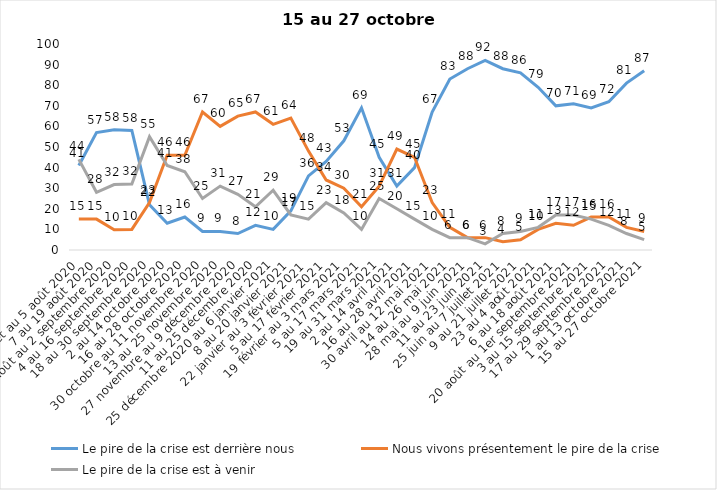
| Category | Le pire de la crise est derrière nous | Nous vivons présentement le pire de la crise | Le pire de la crise est à venir |
|---|---|---|---|
| 24 juillet au 5 août 2020 | 41 | 15 | 44 |
| 7 au 19 août 2020 | 57 | 15 | 28 |
| 21 août au 2 septembre 2020 | 58.39 | 9.84 | 31.77 |
| 4 au 16 septembre 2020 | 58 | 10 | 32 |
| 18 au 30 septembre 2020 | 22 | 23 | 55 |
| 2 au 14 octobre 2020 | 13 | 46 | 41 |
| 16 au 28 octobre 2020 | 16 | 46 | 38 |
| 30 octobre au 11 novembre 2020 | 9 | 67 | 25 |
| 13 au 25 novembre 2020 | 9 | 60 | 31 |
| 27 novembre au 9 décembre 2020 | 8 | 65 | 27 |
| 11 au 25 décembre 2020 | 12 | 67 | 21 |
| 25 décembre 2020 au 6 janvier 2021 | 10 | 61 | 29 |
| 8 au 20 janvier 2021 | 19 | 64 | 17 |
| 22 janvier au 3 février 2021 | 36 | 48 | 15 |
| 5 au 17 février 2021 | 43 | 34 | 23 |
| 19 février au 3 mars 2021 | 53 | 30 | 18 |
| 5 au 17 mars 2021 | 69 | 21 | 10 |
| 19 au 31 mars 2021 | 45 | 31 | 25 |
| 2 au 14 avril 2021 | 31 | 49 | 20 |
| 16 au 28 avril 2021 | 40 | 45 | 15 |
| 30 avril au 12 mai 2021 | 67 | 23 | 10 |
| 14 au 26 mai 2021 | 83 | 11 | 6 |
| 28 mai au 9 juin 2021 | 88 | 6 | 6 |
| 11 au 23 juin 2021 | 92 | 6 | 3 |
| 25 juin au 7 juillet 2021 | 88 | 4 | 8 |
| 9 au 21 juillet 2021 | 86 | 5 | 9 |
| 23 au 4 août 2021 | 79 | 10 | 11 |
| 6 au 18 août 2021 | 70 | 13 | 17 |
| 20 août au 1er septembre 2021 | 71 | 12 | 17 |
| 3 au 15 septembre 2021 | 69 | 16 | 15 |
| 17 au 29 septembre 2021 | 72 | 16 | 12 |
| 1 au 13 octobre 2021 | 81 | 11 | 8 |
| 15 au 27 octobre 2021 | 87 | 9 | 5 |